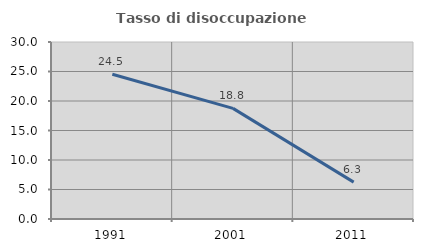
| Category | Tasso di disoccupazione giovanile  |
|---|---|
| 1991.0 | 24.528 |
| 2001.0 | 18.75 |
| 2011.0 | 6.25 |